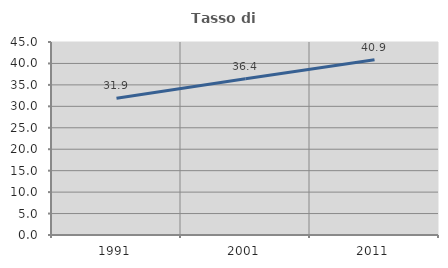
| Category | Tasso di occupazione   |
|---|---|
| 1991.0 | 31.908 |
| 2001.0 | 36.407 |
| 2011.0 | 40.881 |